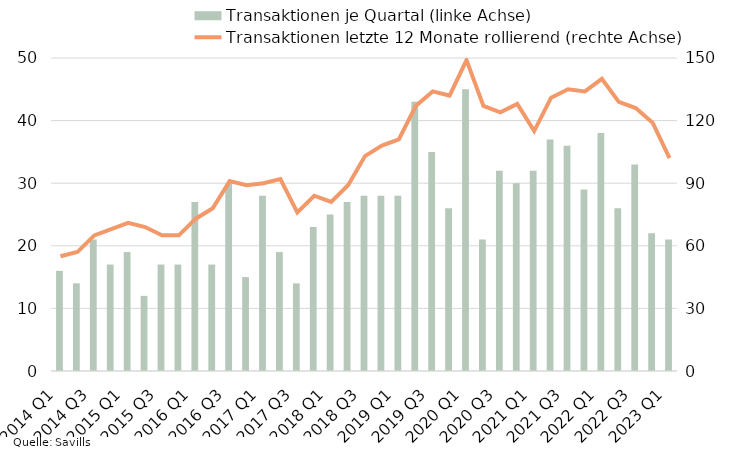
| Category | Transaktionen je Quartal (linke Achse) |
|---|---|
| 2014 Q1 | 16 |
| 2014 Q2 | 14 |
| 2014 Q3 | 21 |
| 2014 Q4 | 17 |
| 2015 Q1 | 19 |
| 2015 Q2 | 12 |
| 2015 Q3 | 17 |
| 2015 Q4 | 17 |
| 2016 Q1 | 27 |
| 2016 Q2 | 17 |
| 2016 Q3 | 30 |
| 2016 Q4 | 15 |
| 2017 Q1 | 28 |
| 2017 Q2 | 19 |
| 2017 Q3 | 14 |
| 2017 Q4 | 23 |
| 2018 Q1 | 25 |
| 2018 Q2 | 27 |
| 2018 Q3 | 28 |
| 2018 Q4 | 28 |
| 2019 Q1 | 28 |
| 2019 Q2 | 43 |
| 2019 Q3 | 35 |
| 2019 Q4 | 26 |
| 2020 Q1 | 45 |
| 2020 Q2 | 21 |
| 2020 Q3 | 32 |
| 2020 Q4 | 30 |
| 2021 Q1 | 32 |
| 2021 Q2 | 37 |
| 2021 Q3 | 36 |
| 2021 Q4 | 29 |
| 2022 Q1 | 38 |
| 2022 Q2 | 26 |
| 2022 Q3 | 33 |
| 2022 Q4 | 22 |
| 2023 Q1 | 21 |